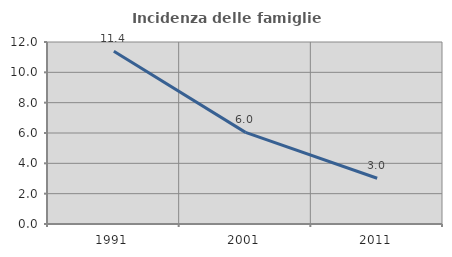
| Category | Incidenza delle famiglie numerose |
|---|---|
| 1991.0 | 11.387 |
| 2001.0 | 6.04 |
| 2011.0 | 3.015 |